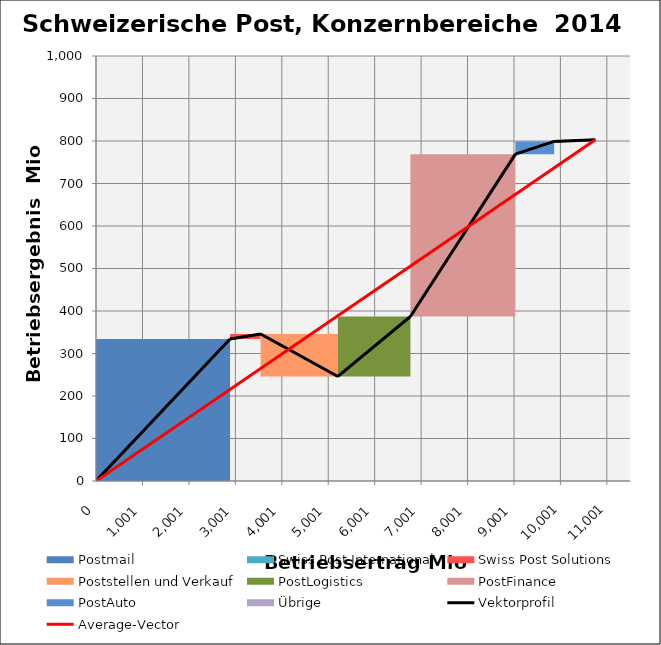
| Category | transparent | Postmail | Swiss Post International | Swiss Post Solutions | Poststellen und Verkauf | PostLogistics | PostFinance | PostAuto | Übrige | Border right & top |
|---|---|---|---|---|---|---|---|---|---|---|
| 0.0 | 0 | 334 | 0 | 0 | 0 | 0 | 0 | 0 | 0 | 0 |
| 2887.0 | 0 | 334 | 0 | 0 | 0 | 0 | 0 | 0 | 0 | 0 |
| 2887.0 | 334 | 0 | 0 | 0 | 0 | 0 | 0 | 0 | 0 | 0 |
| 2887.0 | 334 | 0 | 0 | 0 | 0 | 0 | 0 | 0 | 0 | 0 |
| 2887.0 | 334 | 0 | 0 | 12 | 0 | 0 | 0 | 0 | 0 | 0 |
| 3546.0 | 334 | 0 | 0 | 12 | 0 | 0 | 0 | 0 | 0 | 0 |
| 3546.0 | 346 | 0 | 0 | 0 | -100 | 0 | 0 | 0 | 0 | 0 |
| 5209.0 | 346 | 0 | 0 | 0 | -100 | 0 | 0 | 0 | 0 | 0 |
| 5209.0 | 246 | 0 | 0 | 0 | 0 | 141 | 0 | 0 | 0 | 0 |
| 6771.0 | 246 | 0 | 0 | 0 | 0 | 141 | 0 | 0 | 0 | 0 |
| 6771.0 | 387 | 0 | 0 | 0 | 0 | 0 | 382 | 0 | 0 | 0 |
| 9032.0 | 387 | 0 | 0 | 0 | 0 | 0 | 382 | 0 | 0 | 0 |
| 9032.0 | 769 | 0 | 0 | 0 | 0 | 0 | 0 | 30 | 0 | 0 |
| 9867.0 | 769 | 0 | 0 | 0 | 0 | 0 | 0 | 30 | 0 | 0 |
| 9867.0 | 799 | 0 | 0 | 0 | 0 | 0 | 0 | 0 | 4 | 0 |
| 10753.0 | 799 | 0 | 0 | 0 | 0 | 0 | 0 | 0 | 4 | 0 |
| 10753.0 | 803 | 0 | 0 | 0 | 0 | 0 | 0 | 0 | 0 | 0 |
| 10753.0 | 803 | 0 | 0 | 0 | 0 | 0 | 0 | 0 | 0 | 0 |
| 10753.0 | 803 | 0 | 0 | 0 | 0 | 0 | 0 | 0 | 0 | 0 |
| 10753.0 | 803 | 0 | 0 | 0 | 0 | 0 | 0 | 0 | 0 | 0 |
| 10753.0 | 803 | 0 | 0 | 0 | 0 | 0 | 0 | 0 | 0 | 100 |
| 11500.0 | 803 | 0 | 0 | 0 | 0 | 0 | 0 | 0 | 0 | 100 |
| 11500.0 | 803 | 0 | 0 | 0 | 0 | 0 | 0 | 0 | 0 | 100 |